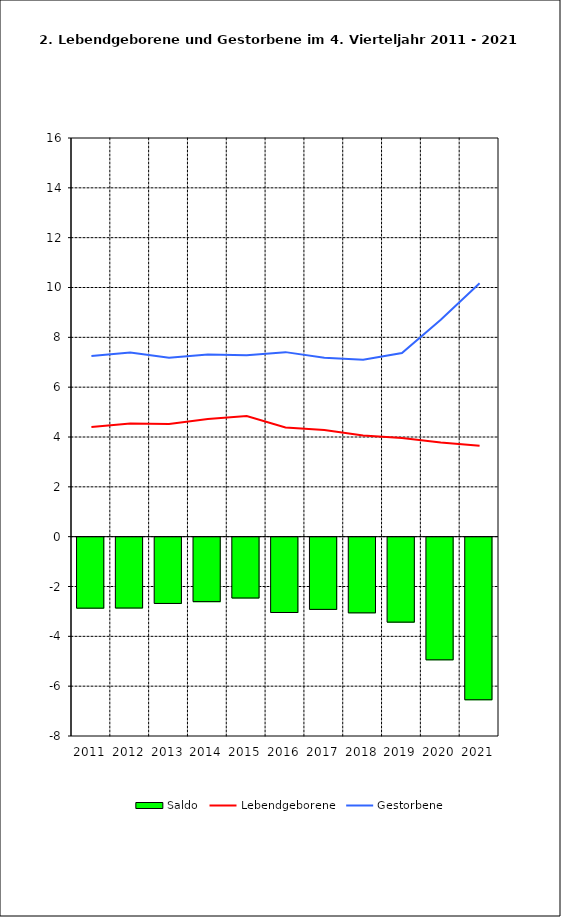
| Category | Saldo |
|---|---|
| 2011.0 | -2.849 |
| 2012.0 | -2.844 |
| 2013.0 | -2.66 |
| 2014.0 | -2.587 |
| 2015.0 | -2.442 |
| 2016.0 | -3.024 |
| 2017.0 | -2.898 |
| 2018.0 | -3.038 |
| 2019.0 | -3.41 |
| 2020.0 | -4.924 |
| 2021.0 | -6.526 |